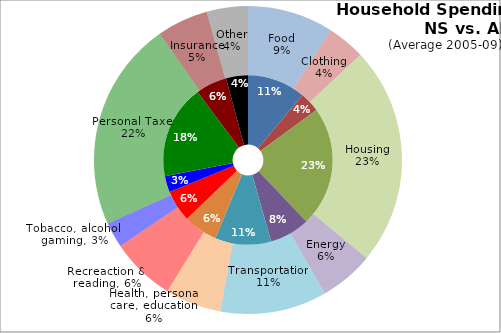
| Category | NS | AB |
|---|---|---|
| Food | 6520.4 | 7536.6 |
| Clothing | 2232.2 | 3334 |
| Housing | 13410.6 | 19175.8 |
| Energy | 4495.4 | 4726.8 |
| Transportation | 6259.2 | 9358.6 |
| Health, personal care, education | 3785.2 | 4916 |
| Recreaction & reading | 3526 | 5659.4 |
| Tobacco, alcohol, gaming | 1812.2 | 2223.6 |
| Personal Taxes | 10497 | 18410.6 |
| Insurance | 3483.6 | 4486.2 |
| Other | 2438.4 | 3618.6 |